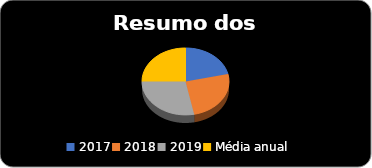
| Category | Series 0 |
|---|---|
| 2017 | 175753.35 |
| 2018 | 208552.82 |
| 2019 | 231537.73 |
| Média anual  | 205281.3 |